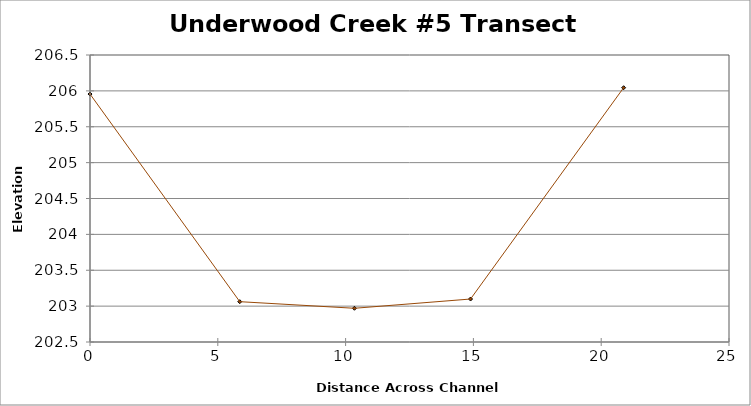
| Category | Series 0 |
|---|---|
| 0.0 | 205.956 |
| 5.859543327366482 | 203.062 |
| 10.346049777442246 | 202.97 |
| 14.887839903407114 | 203.099 |
| 20.87749996984652 | 206.044 |